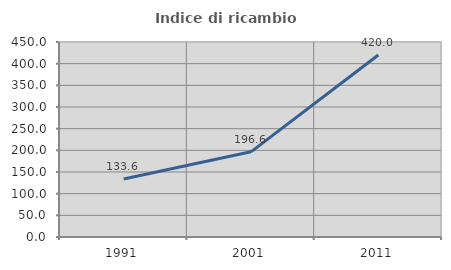
| Category | Indice di ricambio occupazionale  |
|---|---|
| 1991.0 | 133.645 |
| 2001.0 | 196.552 |
| 2011.0 | 420 |